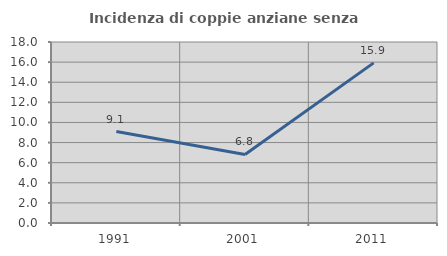
| Category | Incidenza di coppie anziane senza figli  |
|---|---|
| 1991.0 | 9.091 |
| 2001.0 | 6.818 |
| 2011.0 | 15.924 |